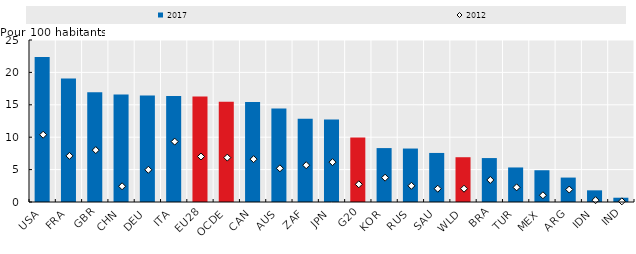
| Category | 2017 |
|---|---|
| USA | 22.36 |
| FRA | 19.04 |
| GBR | 16.93 |
| CHN | 16.58 |
| DEU | 16.42 |
| ITA | 16.35 |
| EU28 | 16.29 |
| OCDE | 15.47 |
| CAN | 15.43 |
| AUS | 14.41 |
| ZAF | 12.84 |
| JPN | 12.72 |
| G20 | 9.95 |
| KOR | 8.32 |
| RUS | 8.25 |
| SAU | 7.57 |
| WLD | 6.91 |
| BRA | 6.78 |
| TUR | 5.33 |
| MEX | 4.9 |
| ARG | 3.77 |
| IDN | 1.8 |
| IND | 0.66 |